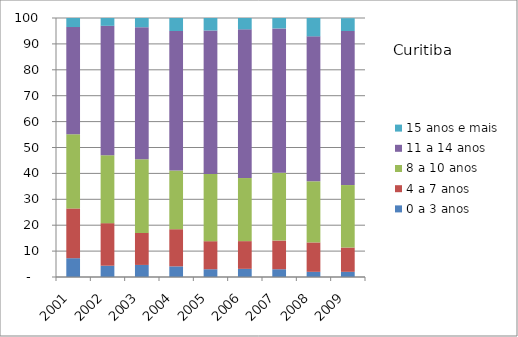
| Category | 0 a 3 anos | 4 a 7 anos | 8 a 10 anos | 11 a 14 anos | 15 anos e mais |
|---|---|---|---|---|---|
| 2001.0 | 7.26 | 19.21 | 28.68 | 41.36 | 3.49 |
| 2002.0 | 4.36 | 16.44 | 26.22 | 49.96 | 3.02 |
| 2003.0 | 4.66 | 12.37 | 28.4 | 51.01 | 3.55 |
| 2004.0 | 4.11 | 14.34 | 22.67 | 53.86 | 5.01 |
| 2005.0 | 3 | 10.83 | 25.98 | 55.36 | 5.05 |
| 2006.0 | 3.15 | 10.7 | 24.36 | 57.4 | 4.39 |
| 2007.0 | 3 | 11.07 | 26.16 | 55.74 | 4.24 |
| 2008.0 | 2 | 11.35 | 23.6 | 55.96 | 7.08 |
| 2009.0 | 2 | 9.38 | 24.12 | 59.48 | 4.95 |